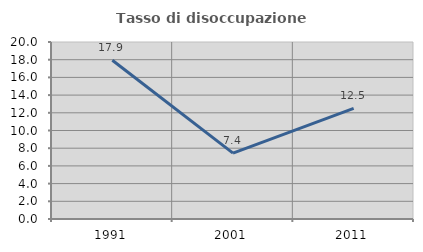
| Category | Tasso di disoccupazione giovanile  |
|---|---|
| 1991.0 | 17.935 |
| 2001.0 | 7.447 |
| 2011.0 | 12.5 |